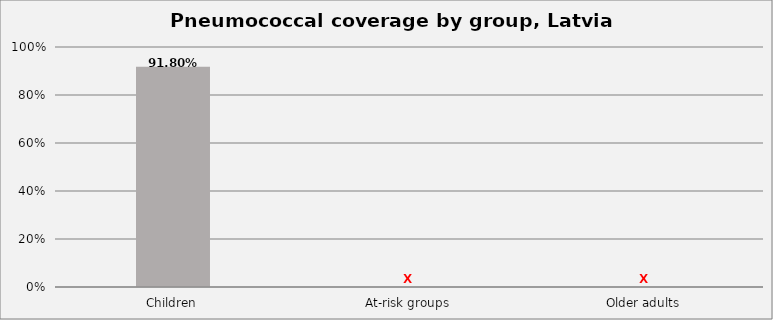
| Category | Series 0 |
|---|---|
| Children | 0.918 |
| At-risk groups | 0 |
| Older adults | 0 |